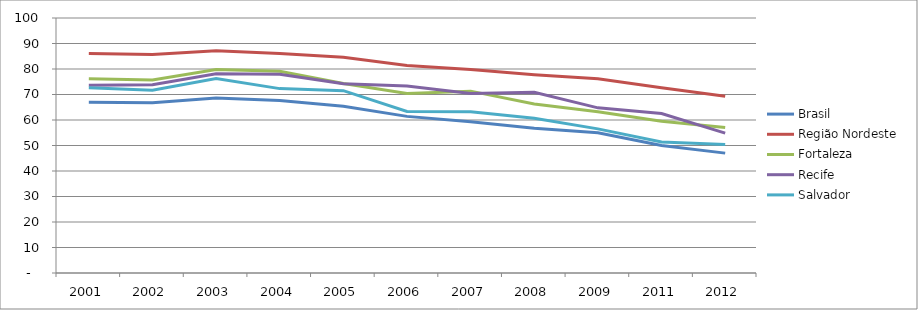
| Category | Brasil | Região Nordeste | Fortaleza | Recife | Salvador |
|---|---|---|---|---|---|
| 2001.0 | 66.92 | 86.06 | 76.14 | 73.6 | 72.66 |
| 2002.0 | 66.72 | 85.72 | 75.73 | 73.8 | 71.7 |
| 2003.0 | 68.65 | 87.2 | 79.79 | 78.17 | 76.31 |
| 2004.0 | 67.61 | 86.06 | 79.15 | 77.9 | 72.31 |
| 2005.0 | 65.41 | 84.59 | 74.32 | 74.24 | 71.5 |
| 2006.0 | 61.42 | 81.37 | 70.42 | 73.33 | 63.33 |
| 2007.0 | 59.32 | 79.76 | 71.32 | 70.44 | 63.19 |
| 2008.0 | 56.8 | 77.75 | 66.29 | 70.85 | 60.69 |
| 2009.0 | 54.96 | 76.18 | 63.22 | 64.77 | 56.52 |
| 2011.0 | 50 | 72.66 | 59.48 | 62.56 | 51.41 |
| 2012.0 | 47.01 | 69.34 | 57.1 | 54.83 | 50.44 |